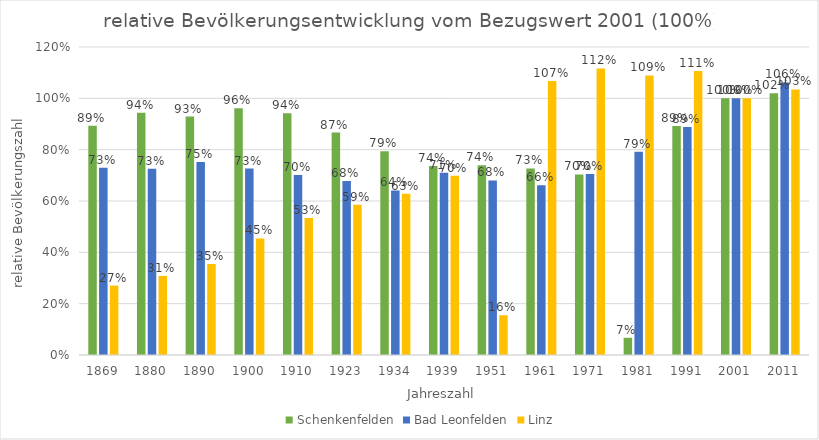
| Category | Schenkenfelden | Bad Leonfelden | Linz |
|---|---|---|---|
| 1869.0 | 0.893 | 0.729 | 0.27 |
| 1880.0 | 0.944 | 0.725 | 0.308 |
| 1890.0 | 0.929 | 0.752 | 0.355 |
| 1900.0 | 0.961 | 0.727 | 0.454 |
| 1910.0 | 0.942 | 0.701 | 0.533 |
| 1923.0 | 0.866 | 0.678 | 0.586 |
| 1934.0 | 0.793 | 0.641 | 0.629 |
| 1939.0 | 0.736 | 0.71 | 0.698 |
| 1951.0 | 0.74 | 0.68 | 0.155 |
| 1961.0 | 0.727 | 0.662 | 1.068 |
| 1971.0 | 0.704 | 0.705 | 1.117 |
| 1981.0 | 0.067 | 0.792 | 1.089 |
| 1991.0 | 0.892 | 0.889 | 1.106 |
| 2001.0 | 1 | 1 | 1 |
| 2011.0 | 1.02 | 1.062 | 1.035 |